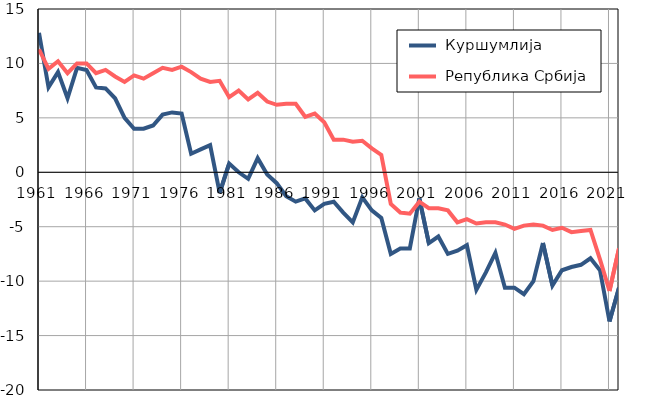
| Category |  Куршумлија |  Република Србија |
|---|---|---|
| 1961.0 | 12.8 | 11.3 |
| 1962.0 | 7.8 | 9.5 |
| 1963.0 | 9.2 | 10.2 |
| 1964.0 | 6.8 | 9.1 |
| 1965.0 | 9.6 | 10 |
| 1966.0 | 9.4 | 10 |
| 1967.0 | 7.8 | 9.1 |
| 1968.0 | 7.7 | 9.4 |
| 1969.0 | 6.8 | 8.8 |
| 1970.0 | 5 | 8.3 |
| 1971.0 | 4 | 8.9 |
| 1972.0 | 4 | 8.6 |
| 1973.0 | 4.3 | 9.1 |
| 1974.0 | 5.3 | 9.6 |
| 1975.0 | 5.5 | 9.4 |
| 1976.0 | 5.4 | 9.7 |
| 1977.0 | 1.7 | 9.2 |
| 1978.0 | 2.1 | 8.6 |
| 1979.0 | 2.5 | 8.3 |
| 1980.0 | -1.9 | 8.4 |
| 1981.0 | 0.8 | 6.9 |
| 1982.0 | 0 | 7.5 |
| 1983.0 | -0.6 | 6.7 |
| 1984.0 | 1.3 | 7.3 |
| 1985.0 | -0.2 | 6.5 |
| 1986.0 | -1 | 6.2 |
| 1987.0 | -2.2 | 6.3 |
| 1988.0 | -2.7 | 6.3 |
| 1989.0 | -2.4 | 5.1 |
| 1990.0 | -3.5 | 5.4 |
| 1991.0 | -2.9 | 4.6 |
| 1992.0 | -2.7 | 3 |
| 1993.0 | -3.7 | 3 |
| 1994.0 | -4.6 | 2.8 |
| 1995.0 | -2.3 | 2.9 |
| 1996.0 | -3.5 | 2.2 |
| 1997.0 | -4.2 | 1.6 |
| 1998.0 | -7.5 | -2.9 |
| 1999.0 | -7 | -3.7 |
| 2000.0 | -7 | -3.8 |
| 2001.0 | -2.4 | -2.7 |
| 2002.0 | -6.5 | -3.3 |
| 2003.0 | -5.9 | -3.3 |
| 2004.0 | -7.5 | -3.5 |
| 2005.0 | -7.2 | -4.6 |
| 2006.0 | -6.7 | -4.3 |
| 2007.0 | -10.8 | -4.7 |
| 2008.0 | -9.2 | -4.6 |
| 2009.0 | -7.4 | -4.6 |
| 2010.0 | -10.6 | -4.8 |
| 2011.0 | -10.6 | -5.2 |
| 2012.0 | -11.2 | -4.9 |
| 2013.0 | -10 | -4.8 |
| 2014.0 | -6.5 | -4.9 |
| 2015.0 | -10.4 | -5.3 |
| 2016.0 | -9 | -5.1 |
| 2017.0 | -8.7 | -5.5 |
| 2018.0 | -8.5 | -5.4 |
| 2019.0 | -7.9 | -5.3 |
| 2020.0 | -9 | -8 |
| 2021.0 | -13.7 | -10.9 |
| 2022.0 | -10.6 | -7 |